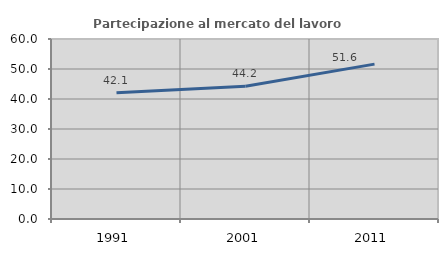
| Category | Partecipazione al mercato del lavoro  femminile |
|---|---|
| 1991.0 | 42.105 |
| 2001.0 | 44.218 |
| 2011.0 | 51.619 |